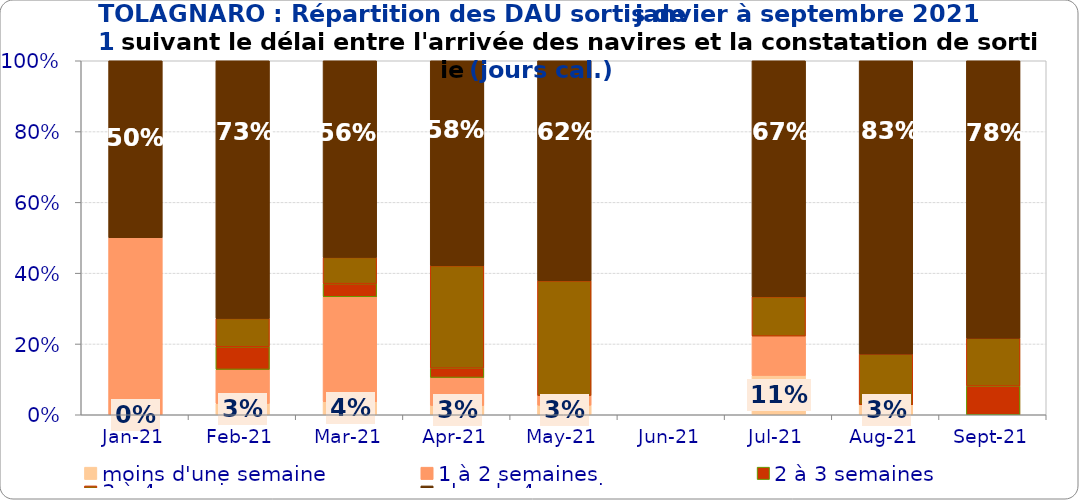
| Category | moins d'une semaine | 1 à 2 semaines | 2 à 3 semaines | 3 à 4 semaines | plus de 4 semaines |
|---|---|---|---|---|---|
| 2021-01-01 | 0 | 0.5 | 0 | 0 | 0.5 |
| 2021-02-01 | 0.032 | 0.096 | 0.064 | 0.08 | 0.728 |
| 2021-03-01 | 0.037 | 0.296 | 0.037 | 0.074 | 0.556 |
| 2021-04-01 | 0.026 | 0.079 | 0.026 | 0.289 | 0.579 |
| 2021-05-01 | 0.027 | 0.027 | 0 | 0.324 | 0.622 |
| 2021-06-01 | 0 | 0 | 0 | 0 | 0 |
| 2021-07-01 | 0.111 | 0.111 | 0 | 0.111 | 0.667 |
| 2021-08-01 | 0.029 | 0 | 0 | 0.143 | 0.829 |
| 2021-09-01 | 0 | 0 | 0.081 | 0.135 | 0.784 |